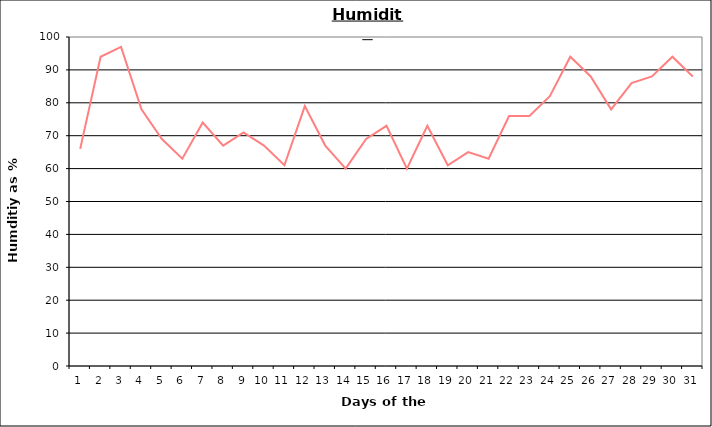
| Category | Series 0 |
|---|---|
| 0 | 66 |
| 1 | 94 |
| 2 | 97 |
| 3 | 78 |
| 4 | 69 |
| 5 | 63 |
| 6 | 74 |
| 7 | 67 |
| 8 | 71 |
| 9 | 67 |
| 10 | 61 |
| 11 | 79 |
| 12 | 67 |
| 13 | 60 |
| 14 | 69 |
| 15 | 73 |
| 16 | 60 |
| 17 | 73 |
| 18 | 61 |
| 19 | 65 |
| 20 | 63 |
| 21 | 76 |
| 22 | 76 |
| 23 | 82 |
| 24 | 94 |
| 25 | 88 |
| 26 | 78 |
| 27 | 86 |
| 28 | 88 |
| 29 | 94 |
| 30 | 88 |